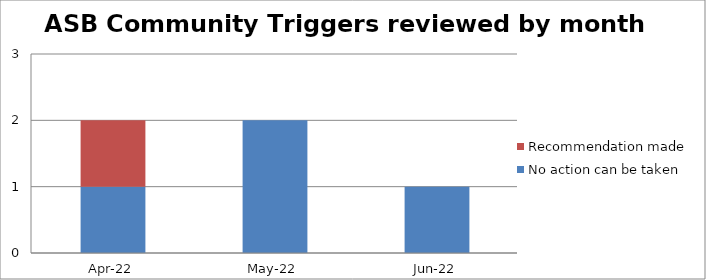
| Category | No action can be taken | Recommendation made |
|---|---|---|
| 2022-04-01 | 1 | 1 |
| 2022-05-01 | 2 | 0 |
| 2022-06-01 | 1 | 0 |